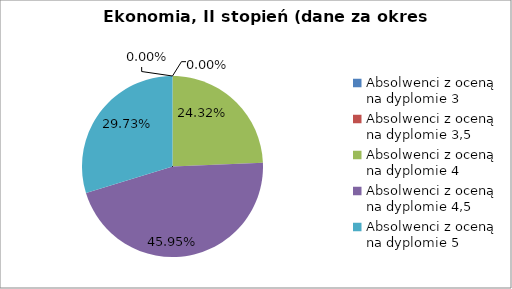
| Category | Series 0 |
|---|---|
| Absolwenci z oceną na dyplomie 3 | 0 |
| Absolwenci z oceną na dyplomie 3,5 | 0 |
| Absolwenci z oceną na dyplomie 4 | 24.324 |
| Absolwenci z oceną na dyplomie 4,5 | 45.946 |
| Absolwenci z oceną na dyplomie 5 | 29.73 |